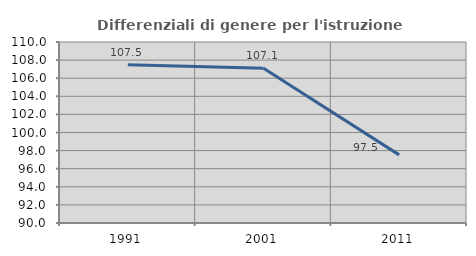
| Category | Differenziali di genere per l'istruzione superiore |
|---|---|
| 1991.0 | 107.488 |
| 2001.0 | 107.097 |
| 2011.0 | 97.528 |